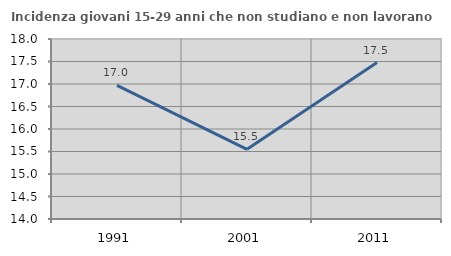
| Category | Incidenza giovani 15-29 anni che non studiano e non lavorano  |
|---|---|
| 1991.0 | 16.968 |
| 2001.0 | 15.548 |
| 2011.0 | 17.476 |